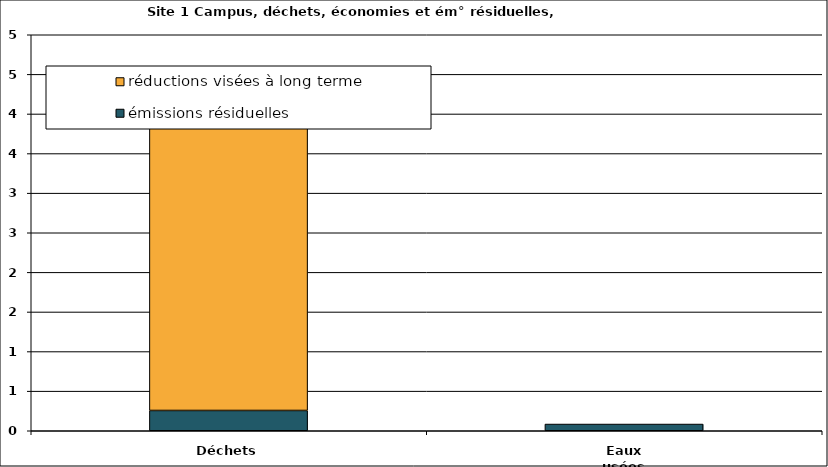
| Category | émissions résiduelles | réductions visées à long terme |
|---|---|---|
| Déchets | 0.256 | 4.2 |
| Eaux usées | 0.085 | 0 |